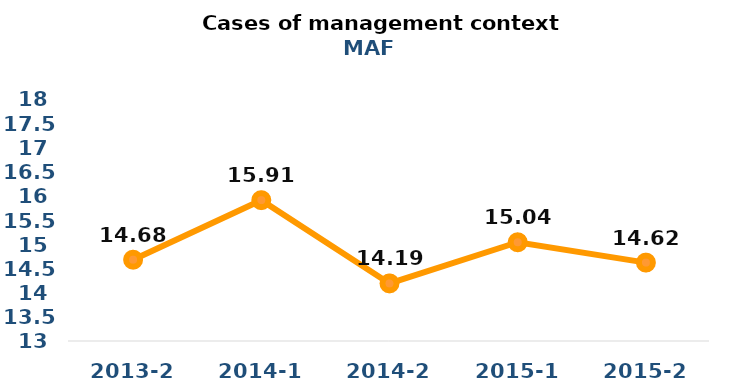
| Category | Series 0 |
|---|---|
| 2013-2 | 14.68 |
| 2014-1 | 15.91 |
| 2014-2 | 14.19 |
| 2015-1 | 15.04 |
| 2015-2 | 14.62 |